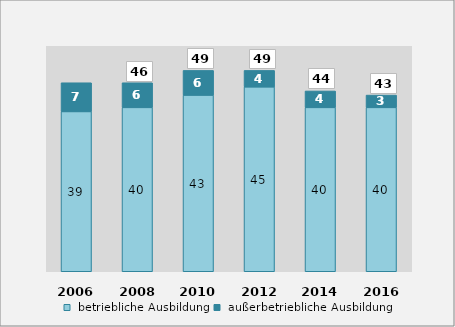
| Category |  betriebliche Ausbildung |  außerbetriebliche Ausbildung |
|---|---|---|
| 2006.0 | 39 | 7 |
| 2008.0 | 40 | 6 |
| 2010.0 | 43 | 6 |
| 2012.0 | 45 | 4 |
| 2014.0 | 40 | 4 |
| 2016.0 | 40 | 3 |